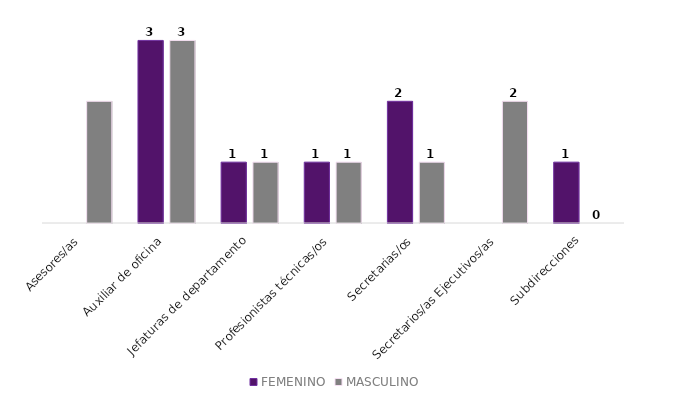
| Category | FEMENINO | MASCULINO |
|---|---|---|
| Asesores/as | 0 | 2 |
| Auxiliar de oficina | 3 | 3 |
| Jefaturas de departamento | 1 | 1 |
| Profesionistas técnicas/os | 1 | 1 |
| Secretarias/os | 2 | 1 |
| Secretarios/as Ejecutivos/as | 0 | 2 |
| Subdirecciones | 1 | 0 |